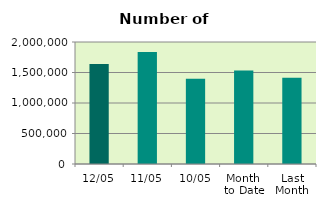
| Category | Series 0 |
|---|---|
| 12/05 | 1640664 |
| 11/05 | 1837094 |
| 10/05 | 1395812 |
| Month 
to Date | 1532261.5 |
| Last
Month | 1414476.2 |